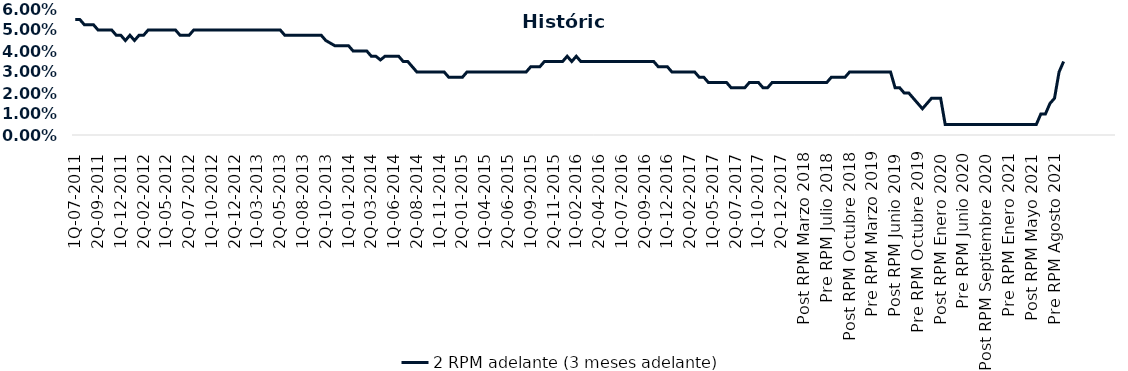
| Category | 2 RPM adelante (3 meses adelante) |
|---|---|
| 1Q-07-2011 | 0.055 |
| 2Q-07-2011 | 0.055 |
| 1Q-08-2011 | 0.052 |
| 2Q-08-2011 | 0.052 |
| 1Q-09-2011 | 0.052 |
| 2Q-09-2011 | 0.05 |
| 1Q-10-2011 | 0.05 |
| 2Q-10-2011 | 0.05 |
| 1Q-11-2011 | 0.05 |
| 2Q-11-2011 | 0.048 |
| 1Q-12-2011 | 0.048 |
| 2Q-12-2011 | 0.045 |
| 1Q-01-2012 | 0.048 |
| 2Q-01-2012 | 0.045 |
| 1Q-02-2012 | 0.048 |
| 2Q-02-2012 | 0.048 |
| 1Q-03-2012 | 0.05 |
| 2Q-03-2012 | 0.05 |
| 1Q-04-2012 | 0.05 |
| 2Q-04-2012 | 0.05 |
| 1Q-05-2012 | 0.05 |
| 2Q-05-2012 | 0.05 |
| 1Q-06-2012 | 0.05 |
| 2Q-06-2012 | 0.048 |
| 1Q-07-2012 | 0.048 |
| 2Q-07-2012 | 0.048 |
| 1Q-08-2012 | 0.05 |
| 2Q-08-2012 | 0.05 |
| 1Q-09-2012 | 0.05 |
| 2Q-09-2012 | 0.05 |
| 1Q-10-2012 | 0.05 |
| 2Q-10-2012 | 0.05 |
| 1Q-11-2012 | 0.05 |
| 2Q-11-2012 | 0.05 |
| 1Q-12-2012 | 0.05 |
| 2Q-12-2012 | 0.05 |
| 1Q-01-2013 | 0.05 |
| 2Q-01-2013 | 0.05 |
| 1Q-02-2013 | 0.05 |
| 2Q-02-2013 | 0.05 |
| 1Q-03-2013 | 0.05 |
| 2Q-03-2013 | 0.05 |
| 1Q-04-2013 | 0.05 |
| 2Q-04-2013 | 0.05 |
| 1Q-05-2013 | 0.05 |
| 2Q-05-2013 | 0.05 |
| 1Q-06-2013 | 0.048 |
| 2Q-06-2013 | 0.048 |
| 1Q-07-2013 | 0.048 |
| 2Q-07-2013 | 0.048 |
| 1Q-08-2013 | 0.048 |
| 2Q-08-2013 | 0.048 |
| 1Q-09-2013 | 0.048 |
| 2Q-09-2013 | 0.048 |
| 1Q-10-2013 | 0.048 |
| 2Q-10-2013 | 0.045 |
| 1Q-11-2013 | 0.044 |
| 2Q-11-2013 | 0.042 |
| 1Q-12-2013 | 0.042 |
| 2Q-12-2013 | 0.042 |
| 1Q-01-2014 | 0.042 |
| 2Q-01-2014 | 0.04 |
| 1Q-02-2014 | 0.04 |
| 2Q-02-2014 | 0.04 |
| 1Q-03-2014 | 0.04 |
| 2Q-03-2014 | 0.038 |
| 1Q-04-2014 | 0.038 |
| 2Q-04-2014 | 0.036 |
| 1Q-05-2014 | 0.038 |
| 2Q-05-2014 | 0.038 |
| 1Q-06-2014 | 0.038 |
| 2Q-06-2014 | 0.038 |
| 1Q-07-2014 | 0.035 |
| 2Q-07-2014 | 0.035 |
| 1Q-08-2014 | 0.032 |
| 2Q-08-2014 | 0.03 |
| 1Q-09-2014 | 0.03 |
| 2Q-09-2014 | 0.03 |
| 1Q-10-2014 | 0.03 |
| 2Q-10-2014 | 0.03 |
| 1Q-11-2014 | 0.03 |
| 2Q-11-2014 | 0.03 |
| 1Q-12-2014 | 0.028 |
| 2Q-12-2014 | 0.028 |
| 1Q-01-2015 | 0.028 |
| 2Q-01-2015 | 0.028 |
| 1Q-02-2015 | 0.03 |
| 2Q-02-2015 | 0.03 |
| 1Q-03-2015 | 0.03 |
| 2Q-03-2015 | 0.03 |
| 1Q-04-2015 | 0.03 |
| 2Q-04-2015 | 0.03 |
| 1Q-05-2015 | 0.03 |
| 2Q-05-2015 | 0.03 |
| 1Q-06-2015 | 0.03 |
| 2Q-06-2015 | 0.03 |
| 1Q-07-2015 | 0.03 |
| 2Q-07-2015 | 0.03 |
| 1Q-08-2015 | 0.03 |
| 2Q-08-2015 | 0.03 |
| 1Q-09-2015 | 0.032 |
| 2Q-09-2015 | 0.032 |
| 1Q-10-2015 | 0.032 |
| 2Q-10-2015 | 0.035 |
| 1Q-11-2015 | 0.035 |
| 2Q-11-2015 | 0.035 |
| 1Q-12-2015 | 0.035 |
| 2Q-12-2015 | 0.035 |
| 1Q-01-2016 | 0.038 |
| 2Q-01-2016 | 0.035 |
| 1Q-02-2016 | 0.038 |
| 2Q-02-2016 | 0.035 |
| 1Q-03-2016 | 0.035 |
| 2Q-03-2016 | 0.035 |
| 1Q-04-2016 | 0.035 |
| 2Q-04-2016 | 0.035 |
| 1Q-05-2016 | 0.035 |
| 2Q-05-2016 | 0.035 |
| 1Q-06-2016 | 0.035 |
| 2Q-06-2016 | 0.035 |
| 1Q-07-2016 | 0.035 |
| 2Q-07-2016 | 0.035 |
| 1Q-08-2016 | 0.035 |
| 2Q-08-2016 | 0.035 |
| 1Q-09-2016 | 0.035 |
| 2Q-09-2016 | 0.035 |
| 1Q-10-2016 | 0.035 |
| 2Q-10-2016 | 0.035 |
| 1Q-11-2016 | 0.032 |
| 2Q-11-2016 | 0.032 |
| 1Q-12-2016 | 0.032 |
| 2Q-12-2016 | 0.03 |
| 1Q-01-2017 | 0.03 |
| 2Q-01-2017 | 0.03 |
| 1Q-02-2017 | 0.03 |
| 2Q-02-2017 | 0.03 |
| 1Q-03-2017 | 0.03 |
| 2Q-03-2017 | 0.028 |
| 1Q-04-2017 | 0.028 |
| 2Q-04-2017 | 0.025 |
| 1Q-05-2017 | 0.025 |
| 2Q-05-2017 | 0.025 |
| 1Q-06-2017 | 0.025 |
| 2Q-06-2017 | 0.025 |
| 1Q-07-2017 | 0.022 |
| 2Q-07-2017 | 0.022 |
| 1Q-08-2017 | 0.022 |
| 2Q-08-2017 | 0.022 |
| 1Q-09-2017 | 0.025 |
| 2Q-09-2017 | 0.025 |
| 1Q-10-2017 | 0.025 |
| 2Q-10-2017 | 0.022 |
| 1Q-11-2017 | 0.022 |
| 2Q-11-2017 | 0.025 |
| 1Q-12-2017 | 0.025 |
| 2Q-12-2017 | 0.025 |
| 1Q-01-2018 | 0.025 |
| 2Q-01-2018 | 0.025 |
| Post RPM Febrero 2018 | 0.025 |
| Pre RPM Marzo 2018 | 0.025 |
| Post RPM Marzo 2018 | 0.025 |
| Pre RPM Mayo 2018 | 0.025 |
| Post RPM Mayo 2018 | 0.025 |
| Pre RPM Junio 2018 | 0.025 |
| Post RPM Junio 2018 | 0.025 |
| Pre RPM Julio 2018 | 0.025 |
| Post RPM Julio 2018 | 0.028 |
| Pre RPM Septiembre 2018 | 0.028 |
| Post RPM Septiembre 2018 | 0.028 |
| Pre RPM Octubre 2018 | 0.028 |
| Post RPM Octubre 2018 | 0.03 |
| Pre RPM Diciembre 2018 | 0.03 |
| Post RPM Diciembre 2018 | 0.03 |
| Pre RPM Enero 2019 | 0.03 |
| Post RPM Enero 2019 | 0.03 |
| Pre RPM Marzo 2019 | 0.03 |
| Post RPM Marzo 2019 | 0.03 |
| Pre RPM Mayo 2019 | 0.03 |
| Post RPM Mayo 2019 | 0.03 |
| Pre RPM Junio 2019 | 0.03 |
| Post RPM Junio 2019 | 0.022 |
| Pre RPM Julio 2019 | 0.022 |
| Post RPM Julio 2019 | 0.02 |
| Pre RPM Septiembre 2019 | 0.02 |
| Post RPM Septiembre 2019 | 0.018 |
| Pre RPM Octubre 2019 | 0.015 |
| Post RPM Octubre 2019 | 0.012 |
| Pre RPM Diciembre 2019 | 0.015 |
| Post RPM Diciembre 2019 | 0.018 |
| Pre RPM Enero 2020 | 0.018 |
| Post RPM Enero 2020 | 0.018 |
| Pre RPM Marzo 2020 | 0.005 |
| Post RPM Marzo 2020 | 0.005 |
| Pre RPM Mayo 2020 | 0.005 |
| Post RPM Mayo 2020 | 0.005 |
| Pre RPM Junio 2020 | 0.005 |
| Post RPM Junio 2020 | 0.005 |
| Pre RPM Julio 2020 | 0.005 |
| Post RPM Julio 2020 | 0.005 |
| Pre RPM Septiembre 2020 | 0.005 |
| Post RPM Septiembre 2020 | 0.005 |
| Pre RPM Octubre 2020 | 0.005 |
| Post RPM Octubre 2020 | 0.005 |
| Pre RPM Diciembre 2020 | 0.005 |
| Post RPM Diciembre 2020 | 0.005 |
| Pre RPM Enero 2021 | 0.005 |
| Post RPM Enero 2021 | 0.005 |
| Pre RPM Marzo 2021 | 0.005 |
| Post RPM Marzo 2021 | 0.005 |
| Pre RPM Mayo 2021 | 0.005 |
| Post RPM Mayo 2021 | 0.005 |
| Pre RPM Junio 2021 | 0.005 |
| Post RPM Junio 2021 | 0.01 |
| Pre RPM Julio 2021 | 0.01 |
| Post RPM Julio 2021 | 0.015 |
| Pre RPM Agosto 2021 | 0.018 |
| Post RPM Agosto 2021 | 0.03 |
| Pre RPM Octubre 2021 | 0.035 |